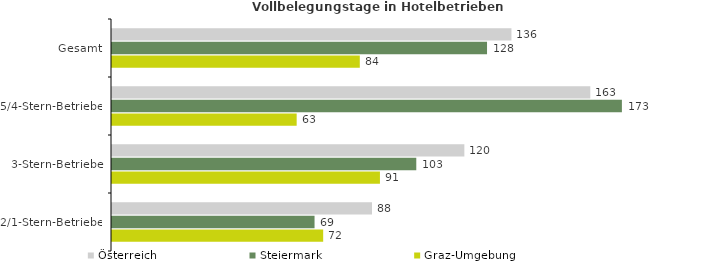
| Category | Österreich | Steiermark | Graz-Umgebung |
|---|---|---|---|
| Gesamt | 135.866 | 127.561 | 84.285 |
| 5/4-Stern-Betriebe | 162.683 | 173.435 | 62.812 |
| 3-Stern-Betriebe | 119.851 | 103.499 | 91.134 |
| 2/1-Stern-Betriebe | 88.435 | 68.894 | 71.829 |